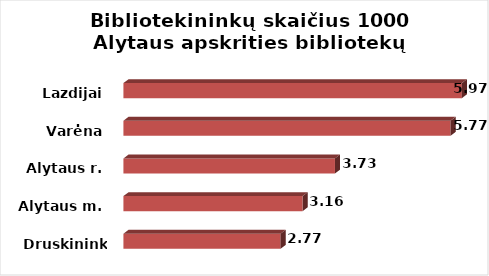
| Category | Series 0 |
|---|---|
| Druskininkai | 2.77 |
| Alytaus m. | 3.159 |
| Alytaus r. | 3.729 |
| Varėna | 5.765 |
| Lazdijai | 5.965 |